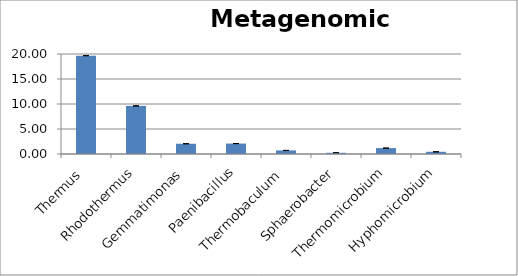
| Category | Series 0 |
|---|---|
| Thermus | 19.665 |
| Rhodothermus | 9.62 |
| Gemmatimonas | 2.05 |
| Paenibacillus | 2.084 |
| Thermobaculum | 0.715 |
| Sphaerobacter | 0.24 |
| Thermomicrobium | 1.18 |
| Hyphomicrobium | 0.44 |